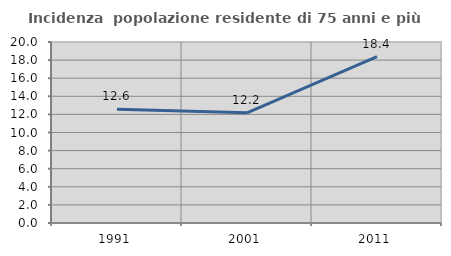
| Category | Incidenza  popolazione residente di 75 anni e più |
|---|---|
| 1991.0 | 12.571 |
| 2001.0 | 12.179 |
| 2011.0 | 18.382 |